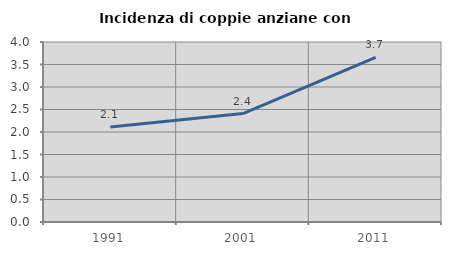
| Category | Incidenza di coppie anziane con figli |
|---|---|
| 1991.0 | 2.113 |
| 2001.0 | 2.41 |
| 2011.0 | 3.659 |